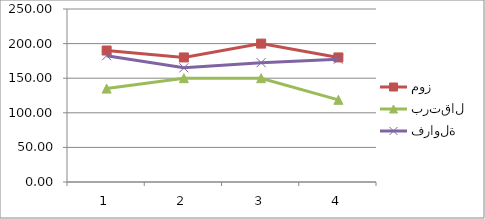
| Category | موز | برتقال | فراولة |
|---|---|---|---|
| 0 | 190 | 135 | 182.5 |
| 1 | 180 | 150 | 165 |
| 2 | 200 | 150 | 172.5 |
| 3 | 180 | 118.75 | 177.5 |